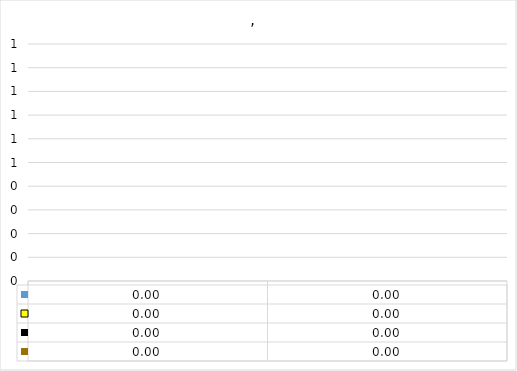
| Category | Series 0 | Series 1 | Series 2 | Series 9 |
|---|---|---|---|---|
| 0 | 0 | 0 | 0 | 0 |
| 1 | 0 | 0 | 0 | 0 |